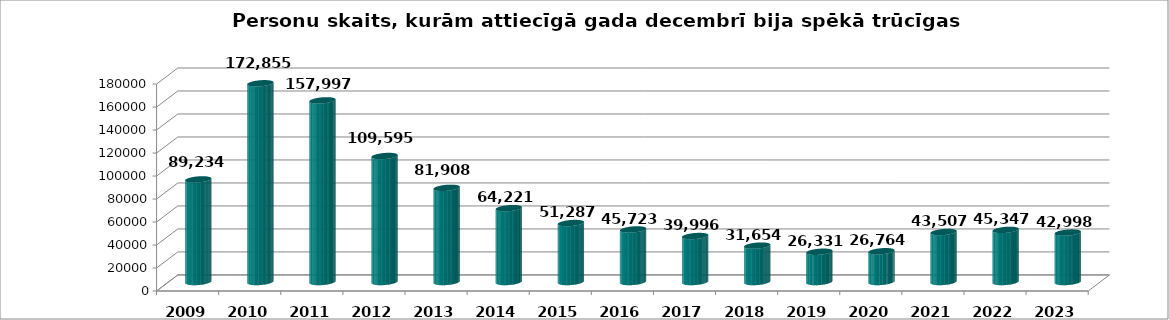
| Category | decembris |
|---|---|
| 2009.0 | 89234 |
| 2010.0 | 172855 |
| 2011.0 | 157997 |
| 2012.0 | 109595 |
| 2013.0 | 81908 |
| 2014.0 | 64221 |
| 2015.0 | 51287 |
| 2016.0 | 45723 |
| 2017.0 | 39996 |
| 2018.0 | 31654 |
| 2019.0 | 26331 |
| 2020.0 | 26764 |
| 2021.0 | 43507 |
| 2022.0 | 45347 |
| 2023.0 | 42998 |